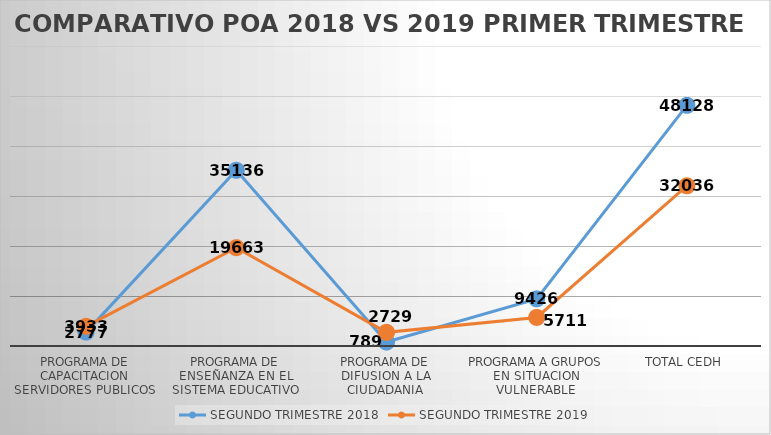
| Category | SEGUNDO TRIMESTRE 2018 | SEGUNDO TRIMESTRE 2019 |
|---|---|---|
| PROGRAMA DE CAPACITACION SERVIDORES PUBLICOS | 2777 | 3933 |
| PROGRAMA DE ENSEÑANZA EN EL SISTEMA EDUCATIVO | 35136 | 19663 |
| PROGRAMA DE DIFUSION A LA CIUDADANIA | 789 | 2729 |
| PROGRAMA A GRUPOS EN SITUACION VULNERABLE | 9426 | 5711 |
| TOTAL CEDH | 48128 | 32036 |